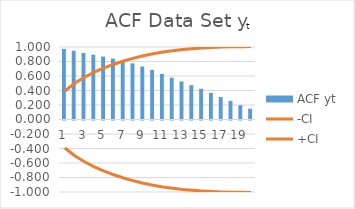
| Category | ACF yt |
|---|---|
| 0 | 0.974 |
| 1 | 0.948 |
| 2 | 0.918 |
| 3 | 0.893 |
| 4 | 0.869 |
| 5 | 0.841 |
| 6 | 0.809 |
| 7 | 0.774 |
| 8 | 0.731 |
| 9 | 0.683 |
| 10 | 0.629 |
| 11 | 0.577 |
| 12 | 0.525 |
| 13 | 0.474 |
| 14 | 0.424 |
| 15 | 0.367 |
| 16 | 0.31 |
| 17 | 0.257 |
| 18 | 0.198 |
| 19 | 0.149 |